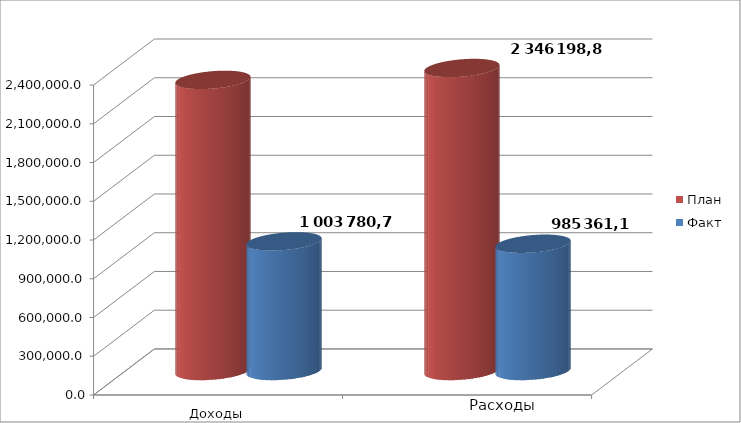
| Category | План | Факт |
|---|---|---|
| 0 | 2254219.2 | 1003780.7 |
| 1 | 2346198.8 | 985361.1 |